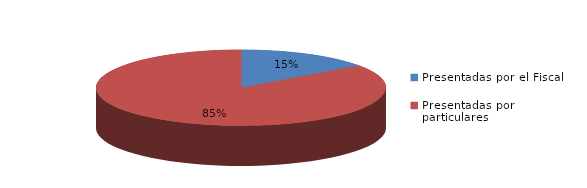
| Category | Series 0 |
|---|---|
| Presentadas por el Fiscal | 84 |
| Presentadas por particulares | 477 |